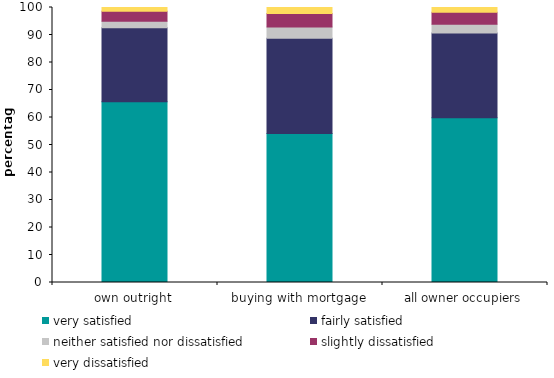
| Category | very satisfied | fairly satisfied | neither satisfied nor dissatisfied | slightly dissatisfied | very dissatisfied |
|---|---|---|---|---|---|
| own outright | 65.694 | 26.904 | 2.409 | 3.659 | 1.335 |
| buying with mortgage | 54.218 | 34.604 | 4.077 | 4.942 | 2.159 |
| all owner occupiers | 59.946 | 30.76 | 3.245 | 4.301 | 1.748 |